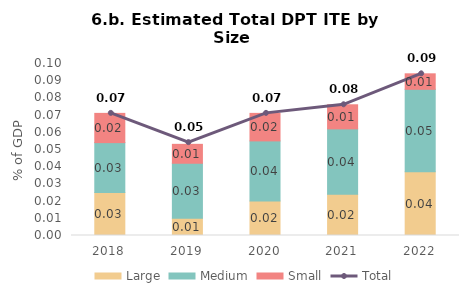
| Category | Large | Medium | Small |
|---|---|---|---|
| 2018.0 | 0.025 | 0.029 | 0.017 |
| 2019.0 | 0.01 | 0.032 | 0.011 |
| 2020.0 | 0.02 | 0.035 | 0.016 |
| 2021.0 | 0.024 | 0.038 | 0.014 |
| 2022.0 | 0.037 | 0.048 | 0.009 |